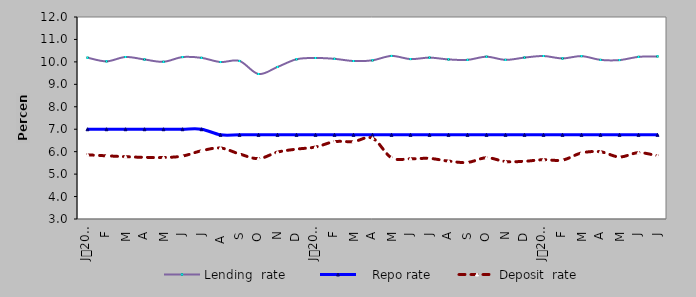
| Category | Lending  rate |    Repo rate | Deposit  rate |
|---|---|---|---|
| 0 | 10.187 | 7 | 5.858 |
| 1900-01-01 | 10.024 | 7 | 5.815 |
| 1900-01-02 | 10.218 | 7 | 5.776 |
| 1900-01-03 | 10.107 | 7 | 5.746 |
| 1900-01-04 | 10.004 | 7 | 5.74 |
| 1900-01-05 | 10.214 | 7 | 5.804 |
| 1900-01-06 | 10.18 | 7 | 6.04 |
| 1900-01-07 | 9.994 | 6.75 | 6.162 |
| 1900-01-08 | 10.042 | 6.75 | 5.898 |
| 1900-01-09 | 9.46 | 6.75 | 5.69 |
| 1900-01-10 | 9.774 | 6.75 | 5.98 |
| 1900-01-11 | 10.117 | 6.75 | 6.113 |
| 1900-01-12 | 10.174 | 6.75 | 6.207 |
| 1900-01-13 | 10.136 | 6.75 | 6.446 |
| 1900-01-14 | 10.04 | 6.75 | 6.45 |
| 1900-01-15 | 10.07 | 6.75 | 6.6 |
| 1900-01-16 | 10.265 | 6.75 | 5.728 |
| 1900-01-17 | 10.125 | 6.75 | 5.682 |
| 1900-01-18 | 10.19 | 6.75 | 5.7 |
| 1900-01-19 | 10.11 | 6.75 | 5.58 |
| 1900-01-20 | 10.09 | 6.75 | 5.52 |
| 1900-01-21 | 10.23 | 6.75 | 5.73 |
| 1900-01-22 | 10.09 | 6.75 | 5.56 |
| 1900-01-23 | 10.192 | 6.75 | 5.572 |
| 1900-01-24 | 10.261 | 6.75 | 5.643 |
| 1900-01-25 | 10.155 | 6.75 | 5.624 |
| 1900-01-26 | 10.257 | 6.75 | 5.943 |
| 1900-01-27 | 10.09 | 6.75 | 5.994 |
| 1900-01-28 | 10.081 | 6.75 | 5.764 |
| 1900-01-29 | 10.224 | 6.75 | 5.956 |
| 1900-01-30 | 10.245 | 6.75 | 5.813 |